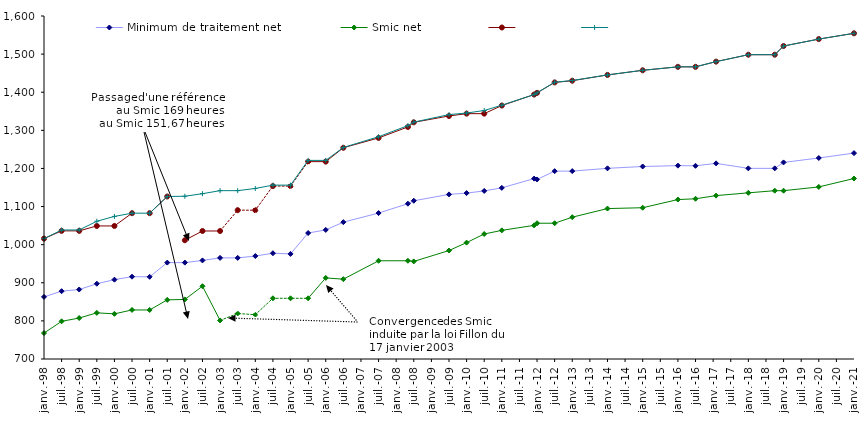
| Category | Minimum de traitement net | Smic net  | Series 5 | Series 6 |
|---|---|---|---|---|
| 1998-01-01 | 862.99 | 768.035 | 1015.87 | 1015.87 |
| 1998-07-01 | 878.01 | 798.829 | 1036.22 | 1038.46 |
| 1999-01-01 | 882.34 | 807.51 | 1036.22 | 1038.58 |
| 1999-07-01 | 897.46 | 821.103 | 1049.11 | 1061.44 |
| 2000-01-01 | 908.18 | 818.513 | 1049.11 | 1074.13 |
| 2000-07-01 | 916 | 828.688 | 1082.6 | 1082.6 |
| 2001-01-01 | 915.58 | 828.688 | 1082.6 | 1082.6 |
| 2001-07-01 | 952.93 | 855.144 | 1126.4 | 1126.4 |
| 2002-01-01 | 952.9 | 856.335 | 1011.64 | 1127.03 |
| 2002-07-01 | 958.62 | 890.98 | 1035.88 | 1133.79 |
| 2003-01-01 | 965.32 | 801.218 | 1035.88 | 1141.73 |
| 2003-07-01 | 965.32 | 819.38 | 1090.51 | 1141.73 |
| 2004-01-01 | 970.15 | 816.27 | 1090.51 | 1147.43 |
| 2004-07-01 | 977.6 | 859.32 | 1153.76 | 1156.23 |
| 2005-01-01 | 975.74 | 859.32 | 1153.76 | 1156.23 |
| 2005-07-01 | 1030.493 | 859.32 | 1217.88 | 1221.11 |
| 2006-01-01 | 1038.75 | 912.73 | 1217.88 | 1221.11 |
| 2006-07-01 | 1059.1 | 909.496 | 1254.28 | 1255.02 |
| 2007-07-01 | 1082.892 | 957.74 | 1280.07 | 1283.2 |
| 2008-05-01 | 1107.534 | 957.74 | 1308.88 | 1312.4 |
| 2008-07-01 | 1115.222 | 956.04 | 1321.02 | 1321.52 |
| 2009-07-01 | 1131.915 | 984.61 | 1337.7 | 1341.29 |
| 2010-01-01 | 1135.316 | 1005.36 | 1343.77 | 1345.32 |
| 2010-07-01 | 1140.995 | 1028 | 1343.77 | 1352.05 |
| 2011-01-01 | 1149.029 | 1037.53 | 1365 | 1365.94 |
| 2011-12-01 | 1173.351 | 1050.63 | 1393.82 | 1393.82 |
| 2012-01-01 | 1171.136 | 1056.24 | 1398.37 | 1398.37 |
| 2012-07-01 | 1192.958 | 1056.24 | 1425.67 | 1426.13 |
| 2013-01-01 | 1192.968 | 1072.07 | 1430.22 | 1430.76 |
| 2014-01-01 | 1200.271 | 1094.71 | 1445.38 | 1445.38 |
| 2015-01-01 | 1205.126 | 1096.94 | 1457.52 | 1457.52 |
| 2016-01-01 | 1207.333 | 1118.36 | 1466.62 | 1466.62 |
| 2016-07-01 | 1206.909 | 1120.43 | 1466.62 | 1466.62 |
| 2017-02-01 | 1213.309 | 1128.7 | 1480.27 | 1480.27 |
| 2018-01-01 | 1200.231 | 1135.99 | 1498.47 | 1498.47 |
| 2018-10-01 | 1200.231 | 1141.61 | 1498.47 | 1498.47 |
| 2019-01-01 | 1215.766 | 1141.61 | 1521.22 | 1521.22 |
| 2020-01-01 | 1227.41 | 1151.5 | 1539.42 | 1539.42 |
| 2021-01-01 | 1240.28 | 1173.6 | 1554.58 | 1554.58 |